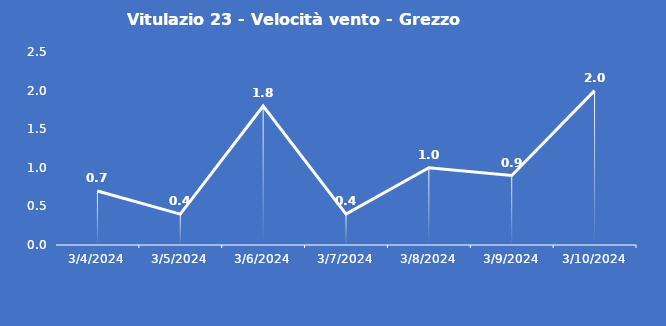
| Category | Vitulazio 23 - Velocità vento - Grezzo (m/s) |
|---|---|
| 3/4/24 | 0.7 |
| 3/5/24 | 0.4 |
| 3/6/24 | 1.8 |
| 3/7/24 | 0.4 |
| 3/8/24 | 1 |
| 3/9/24 | 0.9 |
| 3/10/24 | 2 |